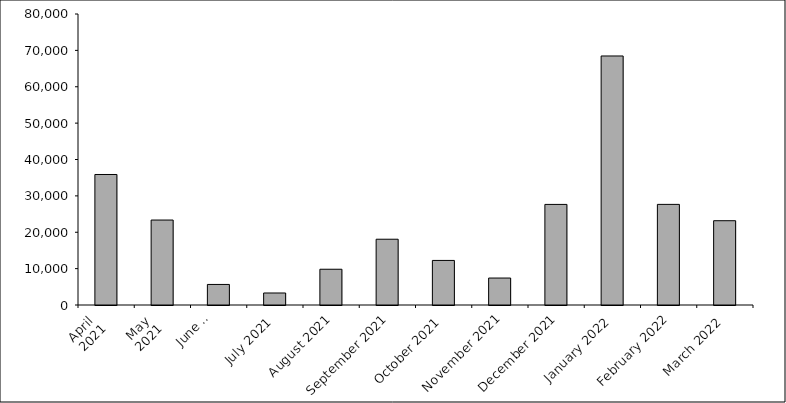
| Category | Series 0 |
|---|---|
| April 
2021 | 35880 |
| May 
2021 | 23359 |
| June 
2021 | 5651 |
| July 2021 | 3302 |
| August 2021 | 9832 |
| September 2021 | 18080 |
| October 2021 | 12251 |
| November 2021 | 7411 |
| December 2021 | 27654 |
| January 2022 | 68459 |
| February 2022 | 27661 |
| March 2022 | 23174 |